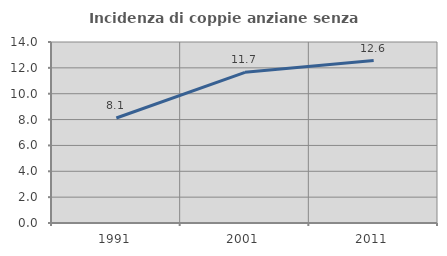
| Category | Incidenza di coppie anziane senza figli  |
|---|---|
| 1991.0 | 8.124 |
| 2001.0 | 11.655 |
| 2011.0 | 12.567 |